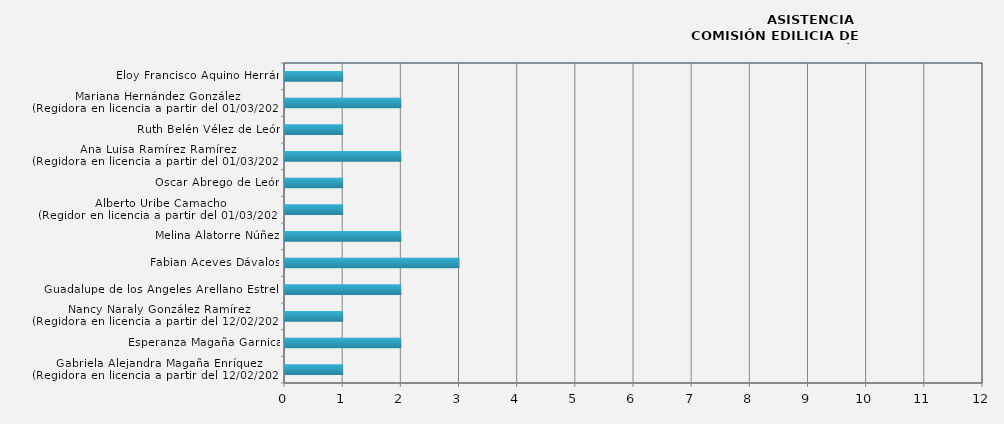
| Category | Gabriela Alejandra Magaña Enríquez
(Regidora en licencia a partir del 12/02/2024) |
|---|---|
| Gabriela Alejandra Magaña Enríquez
(Regidora en licencia a partir del 12/02/2024) | 1 |
| Esperanza Magaña Garnica | 2 |
| Nancy Naraly González Ramírez
(Regidora en licencia a partir del 12/02/2024) | 1 |
| Guadalupe de los Ángeles Arellano Estrella | 2 |
| Fabian Aceves Dávalos | 3 |
| Melina Alatorre Núñez | 2 |
| Alberto Uribe Camacho
(Regidor en licencia a partir del 01/03/2024) | 1 |
| Oscar Abrego de León | 1 |
| Ana Luisa Ramírez Ramírez
(Regidora en licencia a partir del 01/03/2024) | 2 |
| Ruth Belén Vélez de León | 1 |
| Mariana Hernández González
(Regidora en licencia a partir del 01/03/2024) | 2 |
| Eloy Francisco Aquino Herrán | 1 |